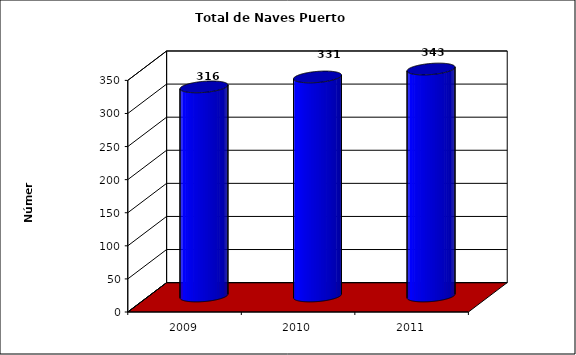
| Category | Series 0 |
|---|---|
| 2009.0 | 316 |
| 2010.0 | 331 |
| 2011.0 | 343 |